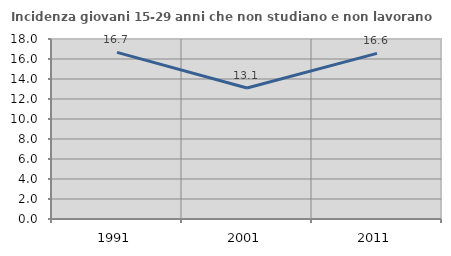
| Category | Incidenza giovani 15-29 anni che non studiano e non lavorano  |
|---|---|
| 1991.0 | 16.667 |
| 2001.0 | 13.1 |
| 2011.0 | 16.564 |